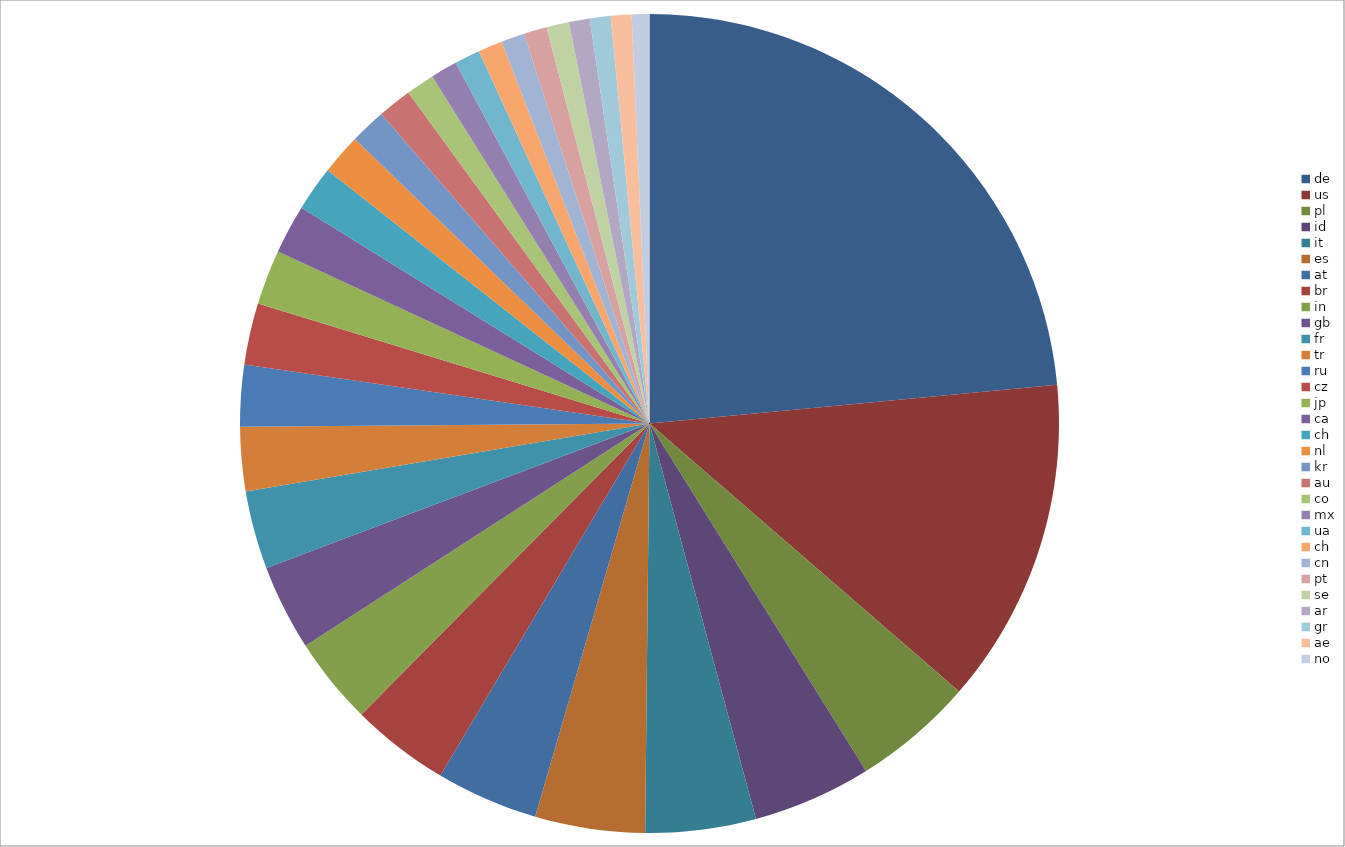
| Category | Series 0 |
|---|---|
| de | 589272 |
| us | 322784 |
| pl | 119748 |
| id | 117460 |
| it | 109293 |
| es | 108743 |
| at | 101036 |
| br | 97623 |
| in | 86502 |
| gb | 84922 |
| fr | 77404 |
| tr | 63455 |
| ru | 60977 |
| cz | 60882 |
| jp | 54543 |
| ca | 48336 |
| ch | 44555 |
| nl | 40497 |
| kr | 35510 |
| au | 33603 |
| co | 28168 |
| mx | 26394 |
| ua | 25358 |
| ch | 24009 |
| cn | 23177 |
| pt | 22960 |
| se | 22274 |
| ar | 20616 |
| gr | 20556 |
| ae | 20499 |
| no | 17473 |